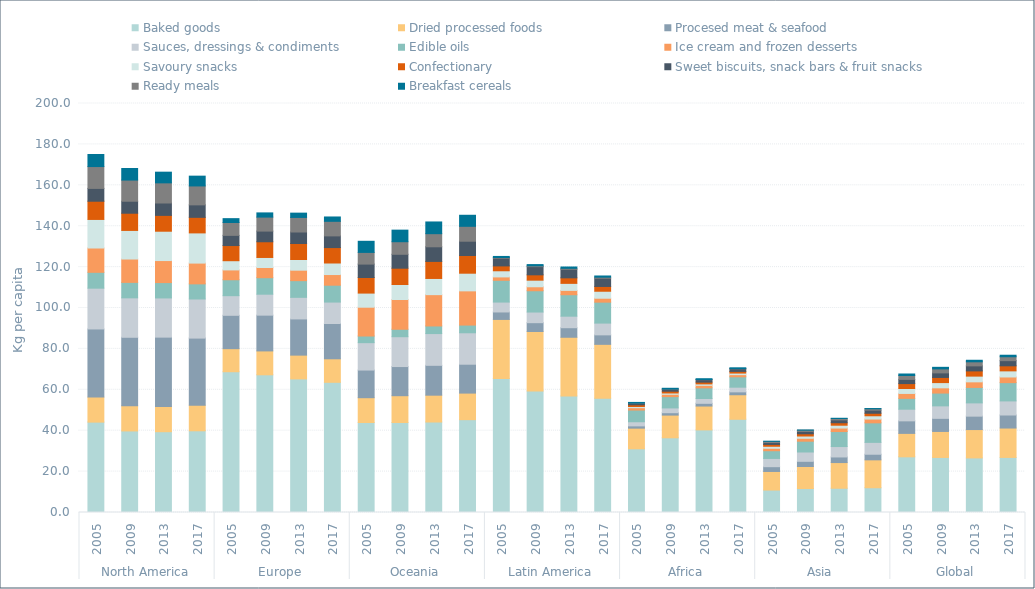
| Category | Baked goods | Dried processed foods | Procesed meat & seafood | Sauces, dressings & condiments | Edible oils | Ice cream and frozen desserts | Savoury snacks | Confectionary | Sweet biscuits, snack bars & fruit snacks | Ready meals | Breakfast cereals |
|---|---|---|---|---|---|---|---|---|---|---|---|
| 0 | 44.195 | 12.223 | 33.332 | 19.948 | 7.754 | 11.885 | 13.968 | 8.903 | 6.274 | 10.679 | 5.914 |
| 1 | 39.88 | 12.352 | 33.452 | 19.279 | 7.568 | 11.419 | 13.982 | 8.412 | 5.868 | 10.347 | 5.652 |
| 2 | 39.506 | 12.365 | 33.885 | 19.164 | 7.511 | 10.768 | 14.346 | 7.74 | 6.062 | 9.85 | 5.22 |
| 3 | 39.951 | 12.508 | 32.822 | 19.122 | 7.401 | 10.155 | 14.766 | 7.611 | 6.098 | 9.249 | 4.79 |
| 4 | 68.837 | 11.279 | 16.313 | 9.601 | 7.786 | 4.805 | 4.505 | 7.41 | 4.983 | 6.282 | 1.891 |
| 5 | 67.328 | 11.684 | 17.487 | 10.249 | 8.069 | 4.997 | 4.896 | 7.68 | 5.218 | 6.84 | 2.055 |
| 6 | 65.33 | 11.62 | 17.712 | 10.55 | 8.158 | 5.12 | 5.234 | 7.82 | 5.619 | 7.123 | 2.102 |
| 7 | 63.664 | 11.498 | 17.27 | 10.464 | 8.252 | 5.213 | 5.642 | 7.543 | 5.717 | 7.121 | 2.127 |
| 8 | 43.998 | 12.141 | 13.517 | 13.395 | 3.249 | 14.086 | 6.905 | 7.608 | 6.574 | 5.713 | 5.433 |
| 9 | 43.997 | 13.119 | 14.256 | 14.591 | 3.647 | 14.538 | 7.348 | 7.965 | 6.808 | 6.144 | 5.66 |
| 10 | 44.248 | 13.118 | 14.602 | 15.523 | 3.726 | 15.311 | 7.918 | 8.334 | 7.152 | 6.411 | 5.73 |
| 11 | 45.399 | 12.988 | 14.123 | 15.375 | 3.763 | 16.732 | 8.636 | 8.651 | 6.989 | 7.29 | 5.399 |
| 12 | 65.562 | 28.853 | 3.644 | 4.843 | 10.632 | 1.665 | 3.005 | 2.38 | 3.779 | 0.321 | 0.528 |
| 13 | 59.361 | 29.136 | 4.322 | 5.205 | 10.407 | 1.951 | 3.225 | 2.614 | 4.008 | 0.406 | 0.595 |
| 14 | 56.974 | 28.715 | 4.669 | 5.636 | 10.488 | 2.131 | 3.435 | 2.703 | 4.17 | 0.479 | 0.648 |
| 15 | 55.861 | 26.369 | 4.637 | 5.751 | 10.242 | 1.918 | 3.418 | 2.339 | 4.03 | 0.498 | 0.589 |
| 16 | 31.151 | 10.095 | 1.117 | 2.019 | 5.715 | 1.155 | 0.572 | 0.826 | 0.802 | 0.055 | 0.323 |
| 17 | 36.525 | 11.106 | 1.168 | 2.342 | 5.513 | 1.15 | 0.639 | 0.871 | 0.997 | 0.064 | 0.368 |
| 18 | 40.393 | 11.665 | 1.327 | 2.363 | 5.203 | 1.224 | 0.714 | 0.862 | 1.207 | 0.075 | 0.393 |
| 19 | 45.588 | 11.991 | 1.417 | 2.293 | 5.06 | 1.066 | 0.767 | 0.811 | 1.286 | 0.073 | 0.408 |
| 20 | 10.975 | 9.09 | 2.339 | 4.034 | 3.771 | 1.187 | 0.994 | 0.892 | 0.932 | 0.563 | 0.059 |
| 21 | 11.72 | 10.777 | 2.53 | 4.558 | 5.282 | 1.417 | 1.122 | 1.068 | 1.171 | 0.609 | 0.081 |
| 22 | 11.858 | 12.559 | 2.742 | 5.091 | 7.337 | 1.709 | 1.39 | 1.202 | 1.393 | 0.687 | 0.105 |
| 23 | 12.106 | 13.647 | 2.738 | 5.799 | 9.556 | 1.856 | 1.599 | 1.227 | 1.515 | 0.666 | 0.133 |
| 24 | 27.219 | 11.464 | 6.128 | 5.697 | 5.306 | 2.406 | 2.417 | 2.397 | 2.065 | 1.891 | 0.739 |
| 25 | 26.914 | 12.72 | 6.406 | 6.105 | 6.259 | 2.561 | 2.559 | 2.511 | 2.244 | 1.953 | 0.76 |
| 26 | 26.689 | 13.87 | 6.558 | 6.484 | 7.558 | 2.731 | 2.8 | 2.552 | 2.462 | 1.983 | 0.754 |
| 27 | 26.931 | 14.375 | 6.37 | 6.893 | 8.94 | 2.758 | 2.992 | 2.464 | 2.531 | 1.911 | 0.736 |